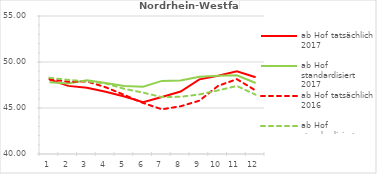
| Category | ab Hof tatsächlich 2017 | ab Hof standardisiert 2017 | ab Hof tatsächlich 2016 | ab Hof standardisiert 2016 |
|---|---|---|---|---|
| 0 | 48.098 | 47.797 | 48.15 | 48.284 |
| 1 | 47.404 | 47.675 | 47.856 | 48.061 |
| 2 | 47.203 | 48.004 | 47.889 | 47.891 |
| 3 | 46.756 | 47.726 | 47.256 | 47.669 |
| 4 | 46.25 | 47.39 | 46.421 | 47.082 |
| 5 | 45.618 | 47.321 | 45.546 | 46.669 |
| 6 | 46.199 | 47.948 | 44.859 | 46.182 |
| 7 | 46.788 | 47.988 | 45.187 | 46.218 |
| 8 | 48.114 | 48.387 | 45.796 | 46.476 |
| 9 | 48.497 | 48.5 | 47.407 | 46.914 |
| 10 | 48.991 | 48.564 | 48.132 | 47.394 |
| 11 | 48.345 | 47.72 | 46.904 | 46.45 |